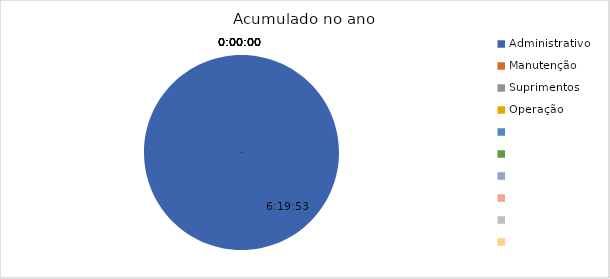
| Category | Total |
|---|---|
| Administrativo | 0.264 |
| Manutenção | 0 |
| Suprimentos | 0 |
| Operação | 0 |